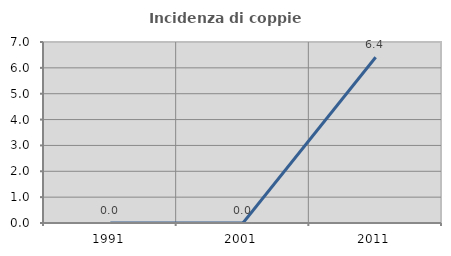
| Category | Incidenza di coppie miste |
|---|---|
| 1991.0 | 0 |
| 2001.0 | 0 |
| 2011.0 | 6.41 |